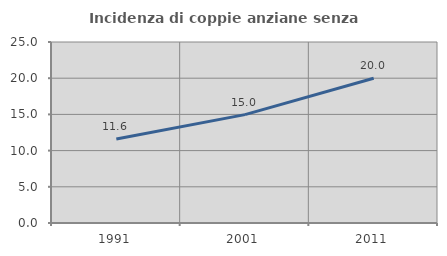
| Category | Incidenza di coppie anziane senza figli  |
|---|---|
| 1991.0 | 11.594 |
| 2001.0 | 14.966 |
| 2011.0 | 19.991 |